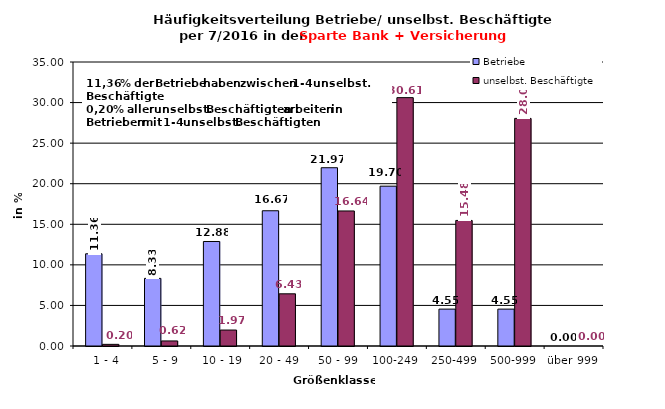
| Category | Betriebe | unselbst. Beschäftigte |
|---|---|---|
|   1 - 4 | 11.364 | 0.202 |
|   5 - 9 | 8.333 | 0.622 |
|  10 - 19 | 12.879 | 1.967 |
| 20 - 49 | 16.667 | 6.431 |
| 50 - 99 | 21.97 | 16.642 |
| 100-249 | 19.697 | 30.609 |
| 250-499 | 4.545 | 15.476 |
| 500-999 | 4.545 | 28.05 |
| über 999 | 0 | 0 |